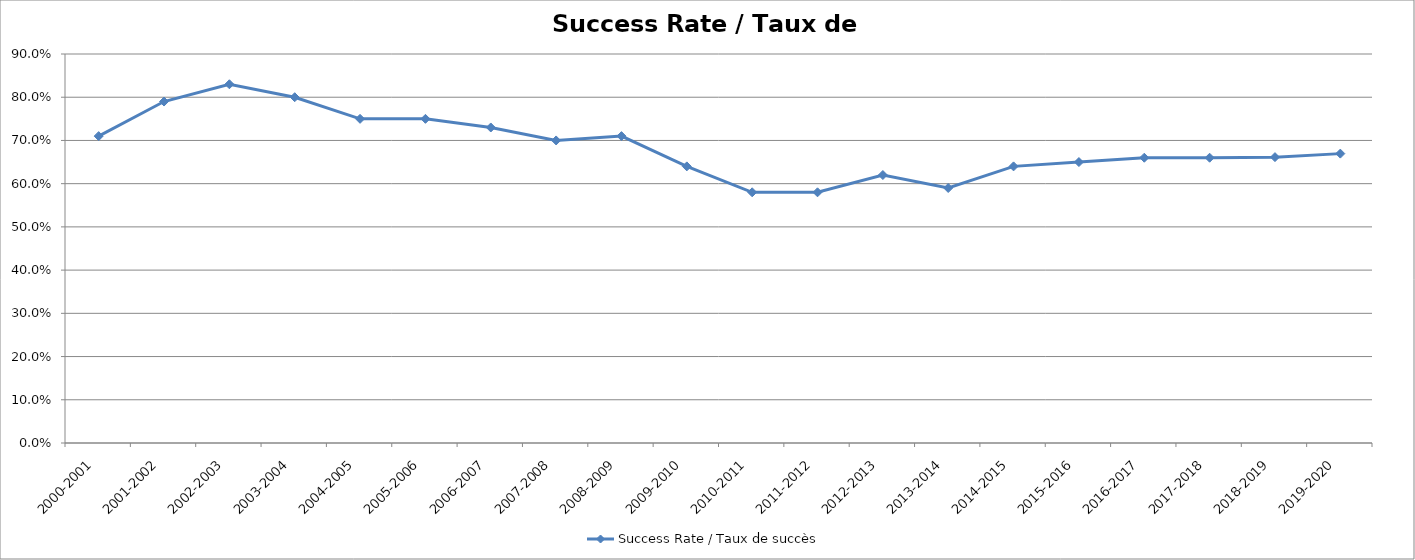
| Category | Success Rate / Taux de succès |
|---|---|
| 2000-2001 | 0.71 |
| 2001-2002 | 0.79 |
| 2002-2003 | 0.83 |
| 2003-2004 | 0.8 |
| 2004-2005 | 0.75 |
| 2005-2006 | 0.75 |
| 2006-2007 | 0.73 |
| 2007-2008 | 0.7 |
| 2008-2009 | 0.71 |
| 2009-2010 | 0.64 |
| 2010-2011 | 0.58 |
| 2011-2012 | 0.58 |
| 2012-2013 | 0.62 |
| 2013-2014 | 0.59 |
| 2014-2015 | 0.64 |
| 2015-2016 | 0.65 |
| 2016-2017 | 0.66 |
| 2017-2018 | 0.66 |
| 2018-2019 | 0.661 |
| 2019-2020 | 0.67 |